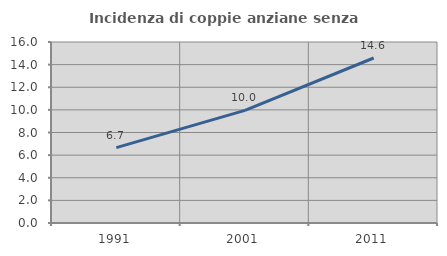
| Category | Incidenza di coppie anziane senza figli  |
|---|---|
| 1991.0 | 6.66 |
| 2001.0 | 9.952 |
| 2011.0 | 14.586 |